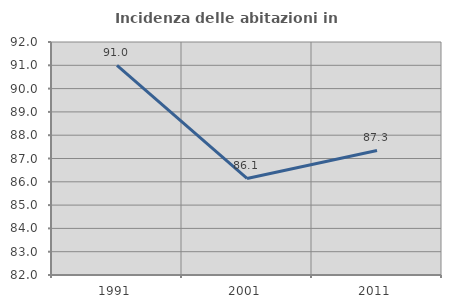
| Category | Incidenza delle abitazioni in proprietà  |
|---|---|
| 1991.0 | 90.997 |
| 2001.0 | 86.145 |
| 2011.0 | 87.346 |